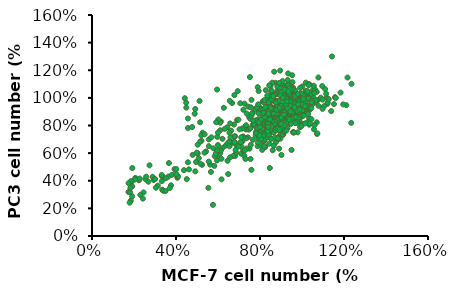
| Category | PC3 |
|---|---|
| 0.9499618999237999 | 0.946 |
| 0.8483616967233935 | 0.918 |
| 0.9154178308356616 | 0.901 |
| 0.9621539243078486 | 0.904 |
| 0.6817373634747269 | 0.722 |
| 1.0261620523241046 | 0.885 |
| 0.9885699771399543 | 0.888 |
| 0.9560579121158242 | 0.912 |
| 0.5120650241300483 | 0.978 |
| 0.8483616967233935 | 0.929 |
| 0.9306578613157226 | 0.923 |
| 0.8859537719075438 | 0.904 |
| 0.8768097536195072 | 0.909 |
| 1.0353060706121413 | 0.913 |
| 1.0170180340360682 | 0.896 |
| 1.034290068580137 | 0.925 |
| 0.9824739649479299 | 0.94 |
| 0.969265938531877 | 0.975 |
| 0.9001778003556007 | 0.93 |
| 0.905257810515621 | 0.901 |
| 0.8757937515875032 | 0.901 |
| 0.8879857759715519 | 0.891 |
| 0.936753873507747 | 0.905 |
| 0.9865379730759462 | 0.951 |
| 1.0525781051562104 | 1.059 |
| 1.0373380746761494 | 1.015 |
| 0.9540259080518161 | 0.996 |
| 0.9611379222758446 | 0.992 |
| 0.9357378714757429 | 0.908 |
| 0.9499618999237999 | 0.961 |
| 1.0363220726441453 | 0.933 |
| 1.0759461518923037 | 0.985 |
| 1.0353060706121413 | 0.997 |
| 0.9824739649479299 | 0.98 |
| 0.936753873507747 | 0.955 |
| 0.9144018288036576 | 0.964 |
| 0.4490728981457963 | 0.93 |
| 1.0078740157480315 | 0.908 |
| 1.1389382778765558 | 0.904 |
| 0.9255778511557023 | 0.956 |
| 1.062738125476251 | 1.059 |
| 0.9743459486918974 | 1 |
| 1.032258064516129 | 1.031 |
| 0.5760731521463043 | 0.225 |
| 0.904241808483617 | 0.974 |
| 0.9357378714757429 | 0.973 |
| 0.9702819405638812 | 0.964 |
| 0.9804419608839218 | 0.991 |
| 0.9286258572517145 | 1.094 |
| 1.016002032004064 | 0.999 |
| 0.9946659893319787 | 0.985 |
| 1.0048260096520194 | 0.94 |
| 0.9306578613157226 | 0.964 |
| 1.0200660401320802 | 0.939 |
| 1.1206502413004826 | 0.956 |
| 1.0891541783083567 | 1.001 |
| 0.9479298958597917 | 1.06 |
| 0.7772415544831089 | 0.918 |
| 0.8910337820675641 | 0.932 |
| 0.9662179324358648 | 1.027 |
| 0.8625857251714504 | 0.927 |
| 0.9733299466598934 | 0.986 |
| 1.157226314452629 | 1.005 |
| 1.1836423672847345 | 1.038 |
| 0.858521717043434 | 1.039 |
| 0.9641859283718568 | 0.929 |
| 0.9133858267716536 | 0.903 |
| 0.8839217678435357 | 0.85 |
| 0.8859537719075438 | 0.888 |
| 1.030226060452121 | 0.942 |
| 0.983489966979934 | 0.896 |
| 1.016002032004064 | 0.974 |
| 0.9286258572517145 | 0.996 |
| 0.9113538227076454 | 0.938 |
| 0.8473456946913894 | 0.967 |
| 0.6136652273304547 | 0.829 |
| 0.9499618999237999 | 0.846 |
| 1.0058420116840234 | 0.877 |
| 1.1226822453644907 | 0.965 |
| 1.1176022352044703 | 1.001 |
| 0.8775356874530428 | 0.978 |
| 0.8474830954169797 | 0.944 |
| 0.9821187077385425 | 0.873 |
| 1.0001502629601804 | 0.813 |
| 0.9304282494365139 | 0.804 |
| 0.983320811419985 | 0.954 |
| 0.8883546205860255 | 0.827 |
| 0.9448534936138242 | 0.929 |
| 0.8847483095416979 | 0.908 |
| 0.909992486851991 | 0.936 |
| 0.6034560480841472 | 0.831 |
| 0.9172051089406461 | 0.859 |
| 0.9111945905334335 | 0.811 |
| 0.9051840721262209 | 0.859 |
| 0.9003756574004508 | 0.898 |
| 0.9039819684447784 | 0.982 |
| 0.9051840721262209 | 0.925 |
| 0.9460555972952667 | 0.904 |
| 0.958076634109692 | 0.846 |
| 0.5265214124718257 | 0.748 |
| 0.9208114199849737 | 0.776 |
| 0.7801652892561983 | 0.821 |
| 0.9460555972952667 | 0.927 |
| 0.983320811419985 | 0.982 |
| 1.0049586776859505 | 1.001 |
| 0.9953418482344102 | 0.915 |
| 0.988129226145755 | 0.892 |
| 0.8739293764087153 | 0.802 |
| 0.9003756574004508 | 0.837 |
| 0.9448534936138242 | 0.925 |
| 0.9484598046581517 | 0.93 |
| 1.0169797145003756 | 1.05 |
| 0.9688955672426747 | 1.002 |
| 0.7981968444778362 | 0.932 |
| 0.9184072126220887 | 0.857 |
| 0.9460555972952667 | 0.857 |
| 0.8823441021788129 | 0.946 |
| 0.8943651389932382 | 0.818 |
| 0.9051840721262209 | 0.89 |
| 0.9111945905334335 | 0.86 |
| 0.8246431254695717 | 0.846 |
| 0.9592787377911345 | 0.895 |
| 0.8883546205860255 | 0.854 |
| 0.8679188580015026 | 0.769 |
| 0.8967693463561233 | 0.773 |
| 0.783771600300526 | 0.754 |
| 0.8474830954169797 | 0.813 |
| 0.8895567242674681 | 0.838 |
| 0.667167543200601 | 0.963 |
| 0.8210368144252442 | 0.867 |
| 0.9688955672426747 | 0.818 |
| 0.520510894064613 | 0.729 |
| 0.8751314800901577 | 0.877 |
| 0.9712997746055597 | 0.873 |
| 0.9208114199849737 | 0.83 |
| 0.98572501878287 | 0.816 |
| 0.7441021788129226 | 0.937 |
| 0.6912096168294516 | 0.839 |
| 0.9592787377911345 | 0.749 |
| 0.8186326070623591 | 0.796 |
| 0.8246431254695717 | 0.854 |
| 0.8667167543200601 | 0.863 |
| 0.9556724267468069 | 0.842 |
| 0.4916604057099925 | 0.919 |
| 0.7597295266716755 | 0.986 |
| 0.9869271224643126 | 0.836 |
| 0.887152516904583 | 0.716 |
| 0.909992486851991 | 0.751 |
| 0.6106686701728024 | 0.765 |
| 0.9364387678437265 | 0.882 |
| 1.0446280991735537 | 0.949 |
| 0.9508640120210368 | 0.94 |
| 1.033809166040571 | 0.853 |
| 0.9340345604808414 | 0.867 |
| 0.7873779113448535 | 0.784 |
| 0.9676934635612322 | 0.961 |
| 0.8847483095416979 | 1.051 |
| 0.9496619083395943 | 1.064 |
| 1.063861758076634 | 0.966 |
| 0.9773102930127724 | 1.02 |
| 0.9427189012018106 | 0.822 |
| 0.9152489464648041 | 0.967 |
| 0.8415795223973779 | 0.833 |
| 0.9302325581395349 | 0.855 |
| 0.8503199625409709 | 0.833 |
| 0.961448415795224 | 0.954 |
| 0.9264866552208522 | 0.978 |
| 0.678008428281567 | 1.02 |
| 0.9352270953644451 | 0.95 |
| 0.9477134384267207 | 0.942 |
| 0.8827844545028875 | 0.884 |
| 0.8415795223973779 | 0.89 |
| 0.9077571406274387 | 0.964 |
| 0.8128609333541439 | 0.863 |
| 0.8365849851724676 | 0.906 |
| 0.941470266895583 | 0.922 |
| 0.9140003121585766 | 0.985 |
| 0.4570001560792883 | 0.782 |
| 0.83533635086624 | 0.95 |
| 0.9189948493834869 | 0.865 |
| 0.884033088809115 | 0.881 |
| 0.8802871858904323 | 0.978 |
| 0.8478226939285157 | 1.002 |
| 0.9826751990010926 | 0.967 |
| 0.9452161698142656 | 1.026 |
| 0.872795380053067 | 0.972 |
| 0.9589511471827689 | 0.996 |
| 0.4420165444045575 | 0.998 |
| 0.9976588106758233 | 1.023 |
| 0.9189948493834869 | 0.961 |
| 0.9252380209146246 | 1.055 |
| 0.904011237708756 | 1.089 |
| 0.9976588106758233 | 0.863 |
| 0.9277352895270797 | 0.945 |
| 0.9364757296706727 | 0.945 |
| 0.9227407523021695 | 0.948 |
| 0.855314499765881 | 0.996 |
| 0.9102544092398939 | 0.918 |
| 0.9876697362260028 | 1.01 |
| 0.9339784610582176 | 1.028 |
| 0.9027626034025285 | 0.938 |
| 0.9102544092398939 | 0.999 |
| 1.038863742781333 | 0.983 |
| 0.8403308880911503 | 0.959 |
| 0.83533635086624 | 0.932 |
| 0.9189948493834869 | 1.086 |
| 0.9227407523021695 | 0.98 |
| 0.9577025128765413 | 1.038 |
| 0.9364757296706727 | 0.911 |
| 0.9002653347900733 | 0.913 |
| 0.8877789917277977 | 0.94 |
| 0.8678008428281567 | 0.905 |
| 0.8653035742157016 | 0.926 |
| 0.9626970501014516 | 0.908 |
| 1.0476041829249259 | 0.951 |
| 1.0076478851256438 | 0.871 |
| 0.9152489464648041 | 0.994 |
| 0.8915248946464804 | 1.05 |
| 0.9676915873263618 | 1.044 |
| 0.9764320274699547 | 0.972 |
| 0.9214921179959419 | 1.02 |
| 1.0963009208678007 | 1.086 |
| 1.1150304354612144 | 1.03 |
| 1.1425003901982207 | 1.3 |
| 1.0563446230685187 | 1.087 |
| 0.9252380209146246 | 0.998 |
| 0.9589511471827689 | 0.93 |
| 0.7978773216794132 | 0.898 |
| 0.9851724676135477 | 1.023 |
| 1.0538473544560636 | 1.006 |
| 1.0650850632121118 | 0.983 |
| 0.9664429530201343 | 1.054 |
| 0.9577025128765413 | 1.018 |
| 0.9514593413454034 | 0.975 |
| 1.0438582800062433 | 0.924 |
| 0.904011237708756 | 0.986 |
| 0.6105821757452786 | 0.82 |
| 1.0176369595754644 | 1.015 |
| 1.0451069143124707 | 1.03 |
| 1.110035898236304 | 1.063 |
| 1.0180699730872742 | 1.028 |
| 0.9862873253876714 | 0.906 |
| 0.9463027040881712 | 0.943 |
| 0.878636421889017 | 0.818 |
| 0.9698833781878765 | 0.861 |
| 0.9196462898885044 | 1.014 |
| 0.9257977700884276 | 1.021 |
| 0.8929898756888376 | 0.951 |
| 1.0354991669870564 | 1.097 |
| 0.9965397923875432 | 1.019 |
| 0.9134948096885813 | 0.875 |
| 0.9268230167884147 | 0.867 |
| 0.9104190695886197 | 0.935 |
| 0.8745354350890683 | 1.108 |
| 0.8581314878892734 | 1.11 |
| 1.0180699730872742 | 1.11 |
| 1.0703575547866204 | 1.043 |
| 0.9780853517877739 | 1.01 |
| 0.8499295142893759 | 1.084 |
| 0.9698833781878765 | 0.98 |
| 0.9309240035883635 | 0.968 |
| 0.9534794309880815 | 0.977 |
| 0.9709086248878637 | 0.964 |
| 0.9422017172882224 | 1.096 |
| 1.0129437395873382 | 1.018 |
| 0.8940151223888249 | 0.951 |
| 0.9339997436883251 | 1.177 |
| 0.8806869152889915 | 0.929 |
| 0.9852620786876842 | 0.975 |
| 0.939125977188261 | 1.025 |
| 0.9575804177880303 | 1.075 |
| 0.9545046776880687 | 0.926 |
| 1.0262719466871717 | 1.049 |
| 0.9381007304882737 | 1.023 |
| 0.9504036908881199 | 1.076 |
| 0.9360502370882994 | 0.971 |
| 0.9022170959887222 | 1.048 |
| 0.9339997436883251 | 0.915 |
| 0.9257977700884276 | 0.989 |
| 0.972959118287838 | 0.924 |
| 0.8468537741894143 | 0.492 |
| 0.9914135588876073 | 0.93 |
| 0.9534794309880815 | 1.164 |
| 0.9001666025887479 | 1.035 |
| 0.8970908624887863 | 0.986 |
| 0.9442522106881969 | 1.038 |
| 0.8673587081891581 | 1.189 |
| 0.9627066512879662 | 0.966 |
| 1.000640779187492 | 0.929 |
| 0.9350249903883122 | 0.963 |
| 0.9073433294886583 | 1.121 |
| 0.995514545687556 | 1.023 |
| 0.9145200563885685 | 0.944 |
| 0.9134948096885813 | 1.051 |
| 0.9093938228886326 | 1.068 |
| 0.9339997436883251 | 0.959 |
| 0.9216967832884788 | 0.776 |
| 0.9780853517877739 | 0.955 |
| 0.9268230167884147 | 0.993 |
| 0.9791105984877612 | 0.75 |
| 0.9032423426887095 | 0.79 |
| 0.9483531974881456 | 0.986 |
| 0.9401512238882481 | 1.028 |
| 0.8601819812892477 | 0.884 |
| 0.9206715365884917 | 0.934 |
| 0.9442522106881969 | 0.939 |
| 0.9637318979879533 | 1.012 |
| 1.0108932461873639 | 0.936 |
| 0.9339997436883251 | 1.09 |
| 0.9514289375881071 | 1.039 |
| 0.9319492502883506 | 1.129 |
| 0.8960656157887992 | 1.197 |
| 0.9001666025887479 | 0.835 |
| 0.939125977188261 | 1.067 |
| 0.9862873253876714 | 0.981 |
| 1.0037165192874535 | 1.003 |
| 1.000640779187492 | 0.985 |
| 1.0016660258874792 | 1.083 |
| 1.0098679994873767 | 1.008 |
| 0.9657823913879278 | 1.021 |
| 0.8424450272342142 | 0.876 |
| 0.9618721000605205 | 0.93 |
| 0.9166834779100262 | 0.945 |
| 0.7843453701835787 | 0.745 |
| 0.7746620940084729 | 0.808 |
| 0.936050030260238 | 0.97 |
| 0.9812386524107323 | 0.939 |
| 0.9876941698608029 | 0.867 |
| 0.9860802904982853 | 0.939 |
| 0.9505749445228969 | 1.002 |
| 0.8117813193463789 | 0.762 |
| 0.45672785959249546 | 0.851 |
| 0.9070002017349204 | 0.866 |
| 0.8827920112971556 | 0.935 |
| 0.3340730280411539 | 0.336 |
| 1.0038329634859795 | 1.017 |
| 0.9634859794230382 | 0.98 |
| 0.4486584627799072 | 0.964 |
| 0.9344361508977204 | 0.96 |
| 0.8456727859592496 | 0.91 |
| 0.802098043171273 | 0.917 |
| 0.8182368367964494 | 0.918 |
| 1.0215856364736735 | 0.986 |
| 1.032882792011297 | 0.995 |
| 0.8827920112971556 | 1.08 |
| 0.4793221706677426 | 0.587 |
| 0.9473471857978616 | 0.967 |
| 0.9215251159975791 | 0.92 |
| 0.8827920112971556 | 1.027 |
| 0.9118418398224732 | 1.04 |
| 0.8682670970344967 | 0.891 |
| 1.005446842848497 | 0.941 |
| 0.5955214847690136 | 1.06 |
| 0.9231389953600968 | 0.928 |
| 0.9505749445228969 | 1.023 |
| 0.9473471857978616 | 0.818 |
| 0.9538027032479323 | 0.853 |
| 0.9005446842848497 | 0.933 |
| 0.4890054468428485 | 0.885 |
| 0.9893080492233206 | 0.899 |
| 0.7520677829332257 | 1.151 |
| 0.7891870082711318 | 1.078 |
| 0.9747831349606617 | 0.901 |
| 0.9344361508977204 | 0.87 |
| 0.9134557191849909 | 1.072 |
| 0.9909219285858382 | 0.788 |
| 0.6277990720193666 | 0.928 |
| 1.047407706273956 | 0.98 |
| 0.9005446842848497 | 1.06 |
| 0.940891668347791 | 1.032 |
| 0.9521888238854146 | 0.937 |
| 0.9150695985475086 | 0.815 |
| 0.9989913253984265 | 0.953 |
| 0.936050030260238 | 0.885 |
| 0.9021585636473674 | 0.762 |
| 0.514827516643131 | 0.823 |
| 0.8440589065967319 | 1.091 |
| 0.8537421827718378 | 1.044 |
| 0.898930804922332 | 1.067 |
| 0.8263062336090378 | 0.982 |
| 0.8747226144845672 | 0.915 |
| 0.8698809763970143 | 0.908 |
| 0.8601977002219084 | 0.873 |
| 0.9602582206980028 | 0.908 |
| 0.6939681258825903 | 1.049 |
| 0.9005446842848497 | 1.039 |
| 0.9279806334476498 | 1.057 |
| 0.9215251159975791 | 0.979 |
| 0.9618721000605205 | 0.963 |
| 0.978010893685697 | 0.936 |
| 1.0457938269114384 | 0.968 |
| 1.032882792011297 | 1.099 |
| 0.9425055477103087 | 0.898 |
| 0.8133951987088965 | 0.972 |
| 0.8279201129715553 | 1.056 |
| 0.9021585636473674 | 0.943 |
| 0.9909219285858382 | 1.072 |
| 0.9554165826104498 | 1.013 |
| 0.9812386524107323 | 0.954 |
| 1.0780714141617913 | 1.148 |
| 0.5663830470380479 | 0.464 |
| 0.3390592390431851 | 0.328 |
| 0.2684218975758549 | 0.393 |
| 0.8604912506020228 | 0.621 |
| 0.7500401348531064 | 0.632 |
| 0.8437951517097447 | 0.668 |
| 0.7371969818590464 | 0.633 |
| 0.9580992133568791 | 1.007 |
| 0.5085888585647776 | 0.564 |
| 0.33263766254615507 | 0.397 |
| 0.5625301011398298 | 0.516 |
| 0.6819714239845882 | 0.579 |
| 0.8759030341948948 | 0.68 |
| 0.8592069353026168 | 0.757 |
| 0.946540375662225 | 0.831 |
| 0.8476480976079628 | 0.749 |
| 0.33263766254615507 | 0.434 |
| 0.5779418847327019 | 0.635 |
| 0.8142558998234066 | 0.758 |
| 0.8476480976079628 | 0.712 |
| 0.8990207095842029 | 0.74 |
| 0.7795793867394445 | 0.728 |
| 0.8283833681168727 | 0.772 |
| 0.7988441162305346 | 0.73 |
| 0.911863862578263 | 1.015 |
| 0.7102263605715203 | 0.596 |
| 0.5561085246427998 | 0.538 |
| 0.31337293305506503 | 0.365 |
| 0.6858243698828063 | 0.603 |
| 0.7063734146733023 | 0.677 |
| 0.304382725959223 | 0.349 |
| 0.8656285117996468 | 0.749 |
| 0.7423342430566704 | 0.714 |
| 0.7654519184459785 | 0.806 |
| 0.3634612297318992 | 0.43 |
| 0.7988441162305346 | 0.727 |
| 0.7590303419489485 | 0.479 |
| 0.8848932412907369 | 0.713 |
| 0.6434419650024081 | 0.786 |
| 0.7205008829667684 | 0.621 |
| 0.5240006421576497 | 0.515 |
| 0.7333440359608284 | 0.772 |
| 0.7564617113501365 | 0.931 |
| 0.648579226200032 | 0.448 |
| 0.8759030341948948 | 0.802 |
| 0.906726601380639 | 0.919 |
| 0.8861775565901429 | 0.768 |
| 0.8373735752127147 | 0.892 |
| 0.8116872692245947 | 0.836 |
| 0.8168245304222187 | 0.717 |
| 0.8412265211109328 | 0.764 |
| 0.4957457055707176 | 0.536 |
| 0.6768341627869642 | 0.807 |
| 0.8348049446139028 | 0.836 |
| 0.8913148177877669 | 0.836 |
| 0.8142558998234066 | 0.848 |
| 0.8913148177877669 | 1.109 |
| 0.8656285117996468 | 0.848 |
| 0.8296676834162787 | 0.757 |
| 0.8694814576978648 | 0.712 |
| 0.38144164392358326 | 0.443 |
| 0.40584363461229733 | 0.438 |
| 0.4379515170974474 | 0.477 |
| 0.8232461069192487 | 0.798 |
| 0.8348049446139028 | 1.016 |
| 0.8001284315299406 | 0.827 |
| 0.8489324129073688 | 0.924 |
| 0.8104029539251887 | 0.79 |
| 0.8592069353026168 | 0.838 |
| 0.6716969015893401 | 0.579 |
| 0.8861775565901429 | 0.836 |
| 0.9503933215604431 | 0.974 |
| 0.39300048161823725 | 0.484 |
| 0.635736073205972 | 0.654 |
| 0.7937068550329106 | 0.78 |
| 0.7487558195537004 | 0.859 |
| 0.8155402151228126 | 0.916 |
| 0.8399422058115267 | 0.758 |
| 0.8925991330871729 | 0.824 |
| 0.8759030341948948 | 0.964 |
| 0.7657393850658858 | 0.696 |
| 0.9985358711566618 | 0.798 |
| 1.0717423133235724 | 0.739 |
| 0.3762811127379209 | 0.367 |
| 1.0702781844802343 | 0.823 |
| 1.0571010248901904 | 0.772 |
| 1.0351390922401171 | 0.806 |
| 1.2108345534407028 | 0.947 |
| 0.9019033674963397 | 0.587 |
| 0.49194729136163984 | 0.468 |
| 0.7920937042459737 | 0.846 |
| 0.8843338213762811 | 0.778 |
| 0.821376281112738 | 0.691 |
| 0.8345534407027818 | 0.714 |
| 0.4568081991215227 | 0.534 |
| 0.9692532942898975 | 0.926 |
| 0.6764275256222547 | 0.72 |
| 0.5036603221083455 | 0.598 |
| 0.8784773060029283 | 0.88 |
| 0.8330893118594437 | 0.767 |
| 0.7276720351390923 | 0.62 |
| 0.34992679355783307 | 0.325 |
| 1.0790629575402635 | 0.942 |
| 1.1522693997071742 | 0.955 |
| 0.9106881405563689 | 0.734 |
| 0.9150805270863837 | 0.822 |
| 0.8843338213762811 | 0.91 |
| 0.8872620790629575 | 0.703 |
| 1.0732064421669107 | 0.743 |
| 1.2342606149341142 | 0.819 |
| 1.1961932650073206 | 0.952 |
| 1.0600292825768667 | 0.803 |
| 0.8740849194729137 | 0.767 |
| 0.8916544655929722 | 0.858 |
| 0.9150805270863837 | 0.855 |
| 0.91800878477306 | 0.768 |
| 0.9765739385065886 | 0.83 |
| 1.026354319180088 | 0.823 |
| 1.0014641288433381 | 0.911 |
| 1.0585651537335286 | 1.037 |
| 1.0380673499267936 | 0.815 |
| 0.8667642752562226 | 0.886 |
| 0.83601756954612 | 0.866 |
| 0.9575402635431918 | 0.752 |
| 1.1054172767203514 | 0.94 |
| 1.1273792093704247 | 0.991 |
| 1.1610541727672035 | 0.999 |
| 0.9516837481698389 | 1.062 |
| 0.6588579795021962 | 0.666 |
| 0.2547584187408492 | 0.411 |
| 0.9150805270863837 | 0.93 |
| 0.2884333821376281 | 0.428 |
| 0.8374816983894583 | 0.816 |
| 1.0980966325036603 | 0.987 |
| 0.9956076134699854 | 1.033 |
| 1.2357247437774523 | 1.102 |
| 0.9619326500732065 | 0.75 |
| 0.7159590043923866 | 0.684 |
| 0.9077598828696926 | 0.79 |
| 0.8169838945827232 | 0.687 |
| 0.9502196193265008 | 0.623 |
| 0.8535871156661786 | 0.703 |
| 1.0980966325036603 | 0.92 |
| 1.2166910688140555 | 1.147 |
| 0.9677891654465594 | 0.818 |
| 0.5212298682284041 | 0.69 |
| 0.29428989751098095 | 0.406 |
| 0.9707174231332357 | 0.906 |
| 0.3323572474377745 | 0.442 |
| 0.3001464128843338 | 0.412 |
| 0.6456808199121523 | 0.671 |
| 0.9399707174231332 | 1.031 |
| 0.8828696925329429 | 0.882 |
| 0.9341142020497804 | 0.843 |
| 0.8448023426061494 | 0.944 |
| 0.849194729136164 | 0.768 |
| 0.8535871156661786 | 0.836 |
| 0.7759882869692533 | 0.807 |
| 0.8814055636896047 | 0.856 |
| 0.7935578330893118 | 1.05 |
| 0.6203150461705594 | 0.636 |
| 0.8843020097772949 | 0.777 |
| 0.6865833785985878 | 0.659 |
| 0.7332971211298207 | 0.707 |
| 0.8908202064095601 | 0.632 |
| 0.8245518739815317 | 0.644 |
| 0.8669201520912547 | 0.81 |
| 0.8614883215643672 | 0.835 |
| 0.6572514937533949 | 0.569 |
| 0.35198261814231396 | 0.418 |
| 0.5953286257468767 | 0.547 |
| 0.9082020640956002 | 0.735 |
| 0.19120043454644214 | 0.287 |
| 0.24551873981531777 | 0.316 |
| 0.40630092341118956 | 0.422 |
| 0.20640956002172733 | 0.42 |
| 0.5431830526887561 | 0.612 |
| 0.7300380228136882 | 0.794 |
| 0.6550787615426399 | 0.685 |
| 0.7897881586094514 | 0.735 |
| 0.6768060836501901 | 0.682 |
| 0.755024443237371 | 0.558 |
| 0.22379141770776753 | 0.404 |
| 0.8039109179793591 | 0.843 |
| 0.18902770233568714 | 0.395 |
| 0.7126561651276481 | 0.646 |
| 0.23030961434003258 | 0.298 |
| 0.6159695817490495 | 0.559 |
| 0.8158609451385117 | 0.725 |
| 0.18468223791417707 | 0.256 |
| 0.5975013579576317 | 0.578 |
| 0.892992938620315 | 0.769 |
| 0.8104291146116241 | 0.623 |
| 0.7876154263986963 | 0.765 |
| 0.6550787615426399 | 0.649 |
| 0.7887017925040739 | 0.65 |
| 0.1792504073872895 | 0.241 |
| 0.65942422596415 | 0.712 |
| 0.7561108093427485 | 0.659 |
| 0.8028245518739815 | 0.769 |
| 0.7463335143943509 | 0.77 |
| 0.6105377512221619 | 0.599 |
| 0.5844649646931016 | 0.578 |
| 0.19120043454644214 | 0.361 |
| 0.4095600217273221 | 0.432 |
| 0.793047256925584 | 0.703 |
| 0.8821292775665399 | 0.839 |
| 0.8408473655621944 | 0.734 |
| 0.2737642585551331 | 0.512 |
| 0.24225964149918522 | 0.271 |
| 0.5822922324823465 | 0.507 |
| 0.8071700162954916 | 0.653 |
| 0.8973384030418251 | 0.705 |
| 0.7897881586094514 | 0.677 |
| 0.8658337859858772 | 0.655 |
| 0.7539380771319935 | 0.849 |
| 0.5562194459532862 | 0.65 |
| 0.8202064095600218 | 0.65 |
| 0.8180336773492667 | 0.696 |
| 0.6453014665942423 | 0.544 |
| 0.931015752308528 | 0.814 |
| 0.9538294405214557 | 0.836 |
| 0.8701792504073873 | 0.814 |
| 0.6322650733297122 | 0.776 |
| 0.935361216730038 | 0.889 |
| 0.7202607278652906 | 0.72 |
| 0.7180879956545356 | 0.715 |
| 0.710483432916893 | 0.715 |
| 0.5355784899511136 | 0.603 |
| 0.5898967952199892 | 0.596 |
| 0.5149375339489408 | 0.682 |
| 0.5964149918522542 | 0.718 |
| 0.7854426941879413 | 0.931 |
| 0.8560564910374796 | 0.834 |
| 0.20532319391634982 | 0.409 |
| 0.931015752308528 | 0.781 |
| 0.8853883758826725 | 0.707 |
| 0.4617055947854427 | 0.482 |
| 0.17381857686040195 | 0.319 |
| 0.6789788158609451 | 0.679 |
| 0.8134220422331502 | 0.975 |
| 0.7266415967601967 | 0.958 |
| 0.7208562337286665 | 0.914 |
| 0.7058142898466879 | 0.961 |
| 0.8238356956899046 | 0.859 |
| 0.4767139137980908 | 0.789 |
| 0.8157361874457623 | 0.892 |
| 0.6016777552791438 | 0.844 |
| 0.7254845241538906 | 0.581 |
| 0.5565519236332079 | 0.699 |
| 0.759039629736766 | 0.871 |
| 0.7914376627133353 | 0.953 |
| 0.7787098640439688 | 0.793 |
| 0.8203644778709864 | 0.965 |
| 0.8967312698871854 | 1.017 |
| 0.6560601677755279 | 0.979 |
| 0.8620190916980041 | 0.998 |
| 0.8249927682962106 | 0.932 |
| 0.18166039919004917 | 0.317 |
| 0.8030083887763957 | 0.804 |
| 0.37026323401793465 | 0.347 |
| 0.8411917847844952 | 0.966 |
| 0.8481342204223316 | 0.933 |
| 0.8562337286664738 | 1.052 |
| 0.8678044547295343 | 0.92 |
| 0.8921029794619613 | 0.977 |
| 0.8573908012727799 | 0.83 |
| 0.8215215504772925 | 0.984 |
| 0.9430141741394272 | 0.973 |
| 0.9245010124385306 | 0.939 |
| 0.1828174717963552 | 0.348 |
| 0.18513161700896733 | 0.396 |
| 0.6213479895863465 | 0.703 |
| 0.8435059299971073 | 0.877 |
| 0.8516054382412497 | 0.924 |
| 0.7648249927682962 | 0.889 |
| 0.9187156494070002 | 1.06 |
| 0.9407000289268151 | 1.067 |
| 0.8874746890367371 | 0.914 |
| 1.0321087648249927 | 1.092 |
| 0.6167196991611223 | 0.41 |
| 0.2580271912062482 | 0.43 |
| 0.7798669366502748 | 0.837 |
| 0.8816893260052068 | 0.836 |
| 0.9152444315880821 | 0.754 |
| 0.8921029794619613 | 0.841 |
| 0.8458200752097194 | 0.848 |
| 0.9545849002024877 | 1.114 |
| 0.9418571015331212 | 0.943 |
| 0.8064796065953138 | 0.761 |
| 0.9140873589817761 | 0.859 |
| 0.9441712467457333 | 0.847 |
| 0.7879664448944171 | 0.778 |
| 0.8909459068556552 | 0.851 |
| 0.9245010124385306 | 0.954 |
| 0.9279722302574487 | 0.975 |
| 0.9638414810529361 | 0.914 |
| 1.0066531674862598 | 0.991 |
| 0.8469771478160255 | 0.815 |
| 0.9152444315880821 | 0.909 |
| 0.9071449233439398 | 0.975 |
| 0.9279722302574487 | 0.918 |
| 0.936071738501591 | 0.904 |
| 0.8816893260052068 | 0.935 |
| 0.8978883424934915 | 0.867 |
| 1.0147526757304022 | 0.94 |
| 1.0286375470060747 | 0.882 |
| 0.9545849002024877 | 0.896 |
| 0.9256580850448366 | 0.867 |
| 0.9164015041943882 | 0.803 |
| 0.9777263523286086 | 0.904 |
| 0.9673126988718542 | 1.002 |
| 0.9036737055250217 | 0.86 |
| 0.9823546427538328 | 0.856 |
| 0.8053225339890078 | 0.701 |
| 1.0147526757304022 | 0.815 |
| 0.9638414810529361 | 1.001 |
| 0.9164015041943882 | 0.76 |
| 0.9684697714781603 | 0.859 |
| 0.9638414810529361 | 0.932 |
| 0.40155642023346305 | 0.484 |
| 0.930739299610895 | 0.923 |
| 0.9473411154345006 | 0.812 |
| 0.8103761348897536 | 0.777 |
| 0.7802853437094682 | 0.752 |
| 0.7833981841763943 | 0.743 |
| 0.8539559014267185 | 0.793 |
| 0.8238651102464332 | 0.802 |
| 0.5364461738002594 | 0.736 |
| 0.45136186770428016 | 0.412 |
| 0.9006485084306096 | 0.812 |
| 0.7304798962386511 | 0.558 |
| 0.9255512321660182 | 0.763 |
| 0.9027237354085603 | 0.854 |
| 0.5540856031128405 | 0.349 |
| 0.1743190661478599 | 0.382 |
| 0.5686121919584954 | 0.714 |
| 0.6132295719844358 | 0.619 |
| 0.8363164721141375 | 0.758 |
| 0.698313878080415 | 0.648 |
| 0.8 | 0.789 |
| 0.7979247730220493 | 0.73 |
| 0.9068741893644617 | 0.873 |
| 0.9452658884565499 | 0.901 |
| 0.8705577172503243 | 1.023 |
| 0.5966277561608301 | 0.62 |
| 0.6619974059662775 | 0.763 |
| 0.77094682230869 | 0.811 |
| 0.7149156939040208 | 0.777 |
| 0.8425421530479896 | 0.821 |
| 0.5914396887159533 | 0.824 |
| 0.8560311284046692 | 0.99 |
| 0.5997405966277561 | 0.659 |
| 0.7086900129701686 | 0.678 |
| 0.6837872892347601 | 0.624 |
| 0.49909208819714657 | 0.603 |
| 0.7543450064850843 | 0.78 |
| 0.919325551232166 | 0.874 |
| 0.8404669260700389 | 0.901 |
| 0.8581063553826199 | 1.015 |
| 0.5167315175097277 | 0.523 |
| 0.503242542153048 | 0.661 |
| 0.8321660181582361 | 0.799 |
| 0.8352788586251622 | 0.814 |
| 0.8383916990920882 | 0.812 |
| 0.7367055771725033 | 0.886 |
| 0.767833981841764 | 0.836 |
| 0.7626459143968871 | 0.888 |
| 0.7024643320363164 | 0.772 |
| 0.9680933852140078 | 1.011 |
| 1.0448767833981842 | 0.846 |
| 0.9203631647211413 | 0.89 |
| 0.951491569390402 | 0.848 |
| 0.8933852140077821 | 0.917 |
| 0.3662775616083009 | 0.528 |
| 0.7948119325551232 | 0.892 |
| 0.9162127107652399 | 0.895 |
| 0.8394293125810636 | 0.789 |
| 0.9400778210116731 | 0.843 |
| 0.8788586251621271 | 0.914 |
| 0.8404669260700389 | 0.885 |
| 0.7927367055771725 | 0.888 |
| 0.6578469520103761 | 0.815 |
| 0.9348897535667964 | 1.046 |
| 0.9027237354085603 | 0.859 |
| 0.988845654993515 | 0.916 |
| 0.9089494163424124 | 1.001 |
| 0.8477302204928664 | 0.845 |
| 0.6547341115434501 | 0.748 |
| 0.5997405966277561 | 0.748 |
| 0.6972762645914397 | 0.842 |
| 0.191958495460441 | 0.492 |
| 0.980544747081712 | 1.028 |
| 0.7335927367055771 | 0.802 |
| 0.7937743190661478 | 0.823 |
| 0.40155642023346305 | 0.448 |
| 0.9141374837872892 | 0.878 |
| 0.8923476005188068 | 0.927 |
| 0.2272373540856031 | 0.416 |
| 0.8643320363164722 | 1.012 |